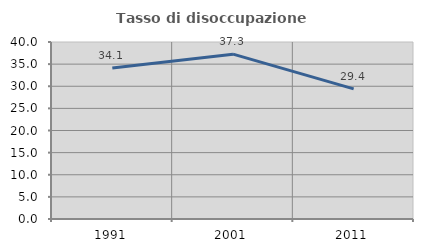
| Category | Tasso di disoccupazione giovanile  |
|---|---|
| 1991.0 | 34.118 |
| 2001.0 | 37.255 |
| 2011.0 | 29.412 |